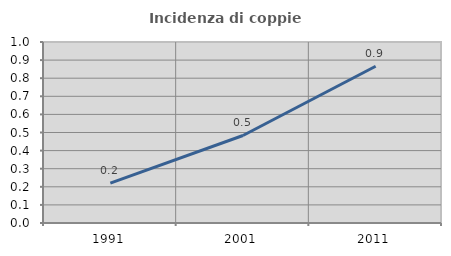
| Category | Incidenza di coppie miste |
|---|---|
| 1991.0 | 0.22 |
| 2001.0 | 0.484 |
| 2011.0 | 0.866 |